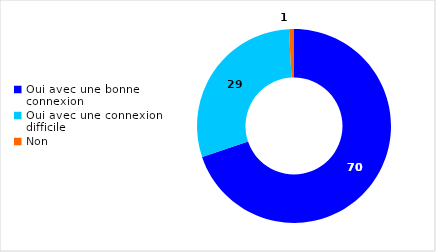
| Category | Series 0 |
|---|---|
| Oui avec une bonne connexion | 69.84 |
| Oui avec une connexion difficile | 29.34 |
| Non | 0.82 |